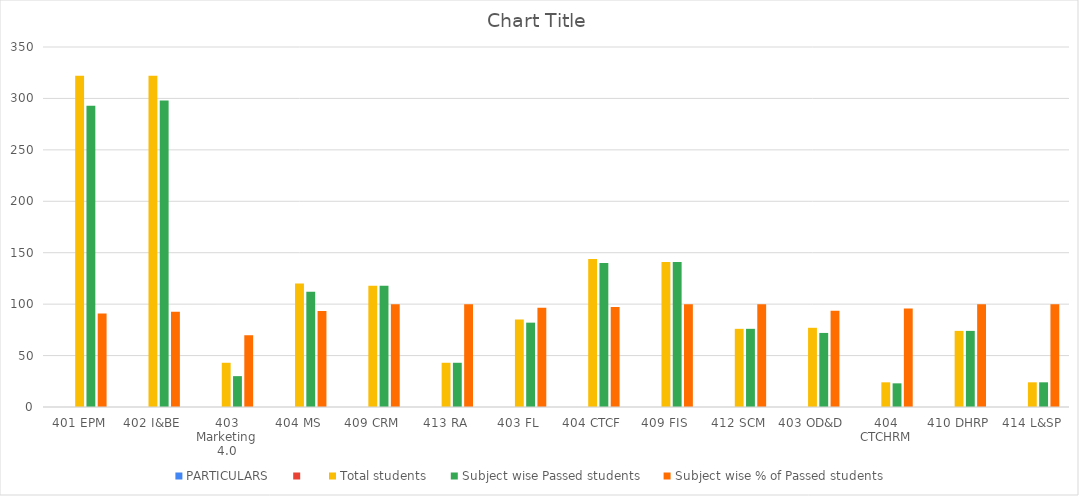
| Category | PARTICULARS | Total students | Subject wise Passed students | Subject wise % of Passed students |
|---|---|---|---|---|
| 401 EPM |  | 322 | 293 | 90.994 |
| 402 I&BE |  | 322 | 298 | 92.547 |
| 403 Marketing 4.0 |  | 43 | 30 | 69.767 |
| 404 MS |  | 120 | 112 | 93.333 |
| 409 CRM |  | 118 | 118 | 100 |
| 413 RA |  | 43 | 43 | 100 |
| 403 FL |  | 85 | 82 | 96.471 |
| 404 CTCF |  | 144 | 140 | 97.222 |
| 409 FIS |  | 141 | 141 | 100 |
| 412 SCM |  | 76 | 76 | 100 |
| 403 OD&D |  | 77 | 72 | 93.506 |
| 404 CTCHRM |  | 24 | 23 | 95.833 |
| 410 DHRP |  | 74 | 74 | 100 |
| 414 L&SP |  | 24 | 24 | 100 |